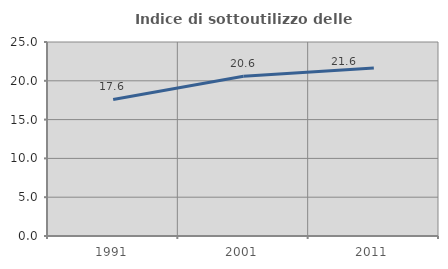
| Category | Indice di sottoutilizzo delle abitazioni  |
|---|---|
| 1991.0 | 17.59 |
| 2001.0 | 20.595 |
| 2011.0 | 21.639 |